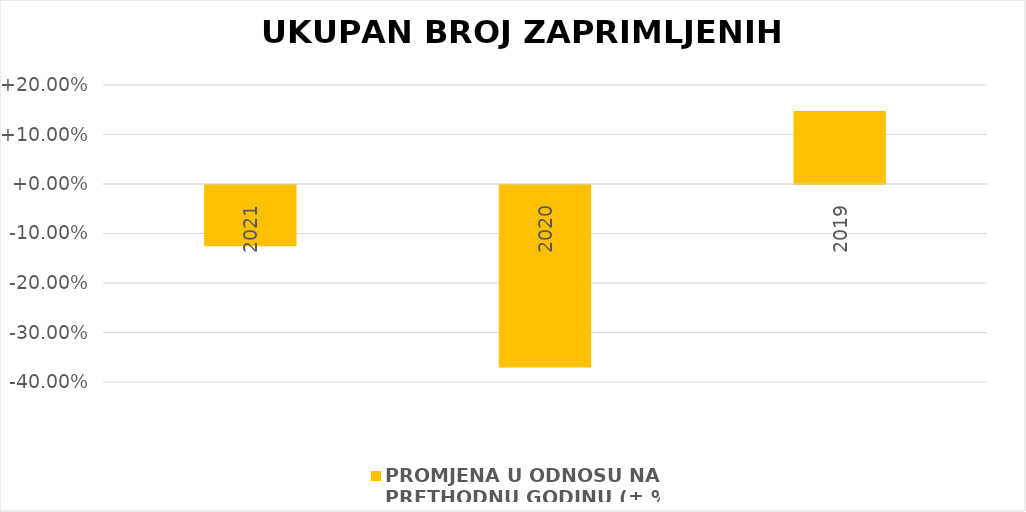
| Category | PROMJENA U ODNOSU NA 
PRETHODNU GODINU (± %) |
|---|---|
| 2021.0 | -0.124 |
| 2020.0 | -0.369 |
| 2019.0 | 0.147 |